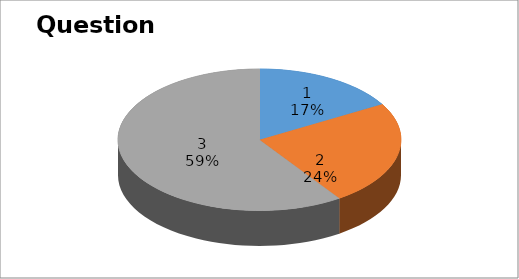
| Category | Series 0 |
|---|---|
| 0 | 7 |
| 1 | 10 |
| 2 | 25 |